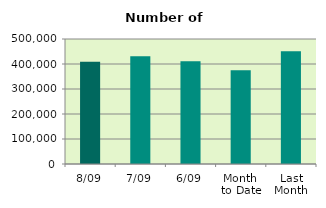
| Category | Series 0 |
|---|---|
| 8/09 | 408808 |
| 7/09 | 430990 |
| 6/09 | 410598 |
| Month 
to Date | 375269.667 |
| Last
Month | 451097.913 |